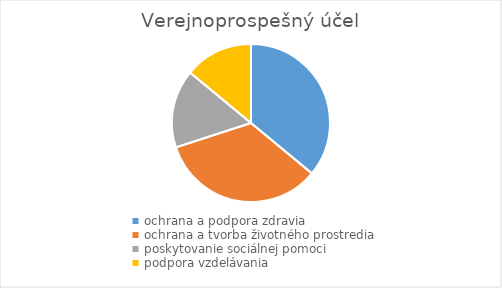
| Category | Series 0 |
|---|---|
| ochrana a podpora zdravia | 0.36 |
| ochrana a tvorba životného prostredia | 0.34 |
| poskytovanie sociálnej pomoci | 0.16 |
| podpora vzdelávania | 0.14 |